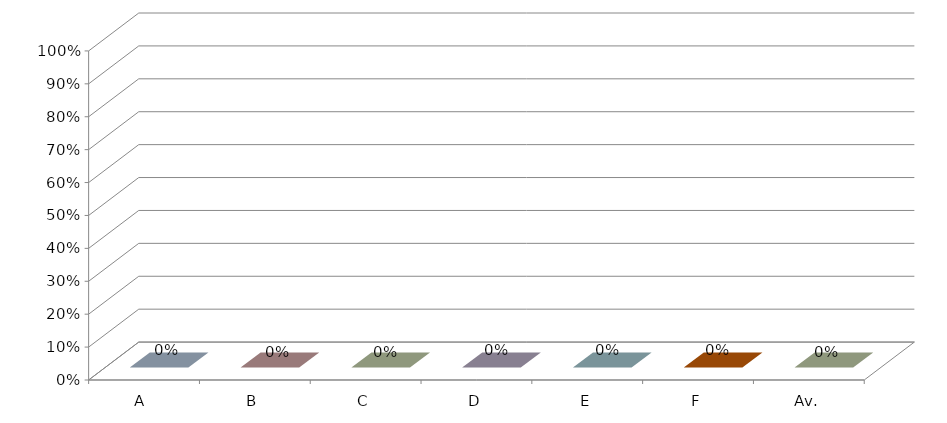
| Category | Series 3 |
|---|---|
| A  | 0 |
| B | 0 |
| C | 0 |
| D | 0 |
| E | 0 |
| F | 0 |
| Av. | 0 |